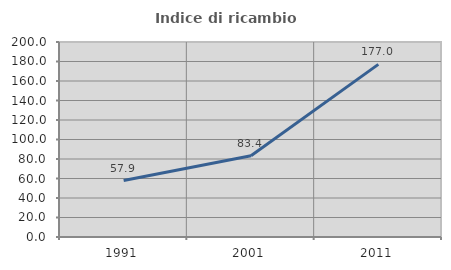
| Category | Indice di ricambio occupazionale  |
|---|---|
| 1991.0 | 57.884 |
| 2001.0 | 83.375 |
| 2011.0 | 177.032 |